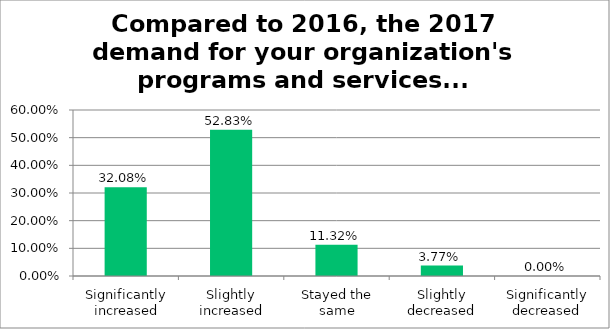
| Category | Responses |
|---|---|
| Significantly increased | 0.321 |
| Slightly increased | 0.528 |
| Stayed the same | 0.113 |
| Slightly decreased | 0.038 |
| Significantly decreased | 0 |